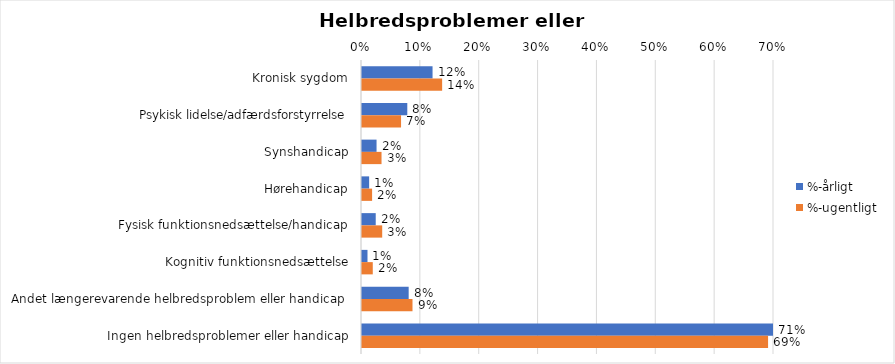
| Category | %-årligt | %-ugentligt |
|---|---|---|
| Kronisk sygdom | 0.12 | 0.136 |
| Psykisk lidelse/adfærdsforstyrrelse | 0.077 | 0.066 |
| Synshandicap | 0.025 | 0.033 |
| Hørehandicap | 0.012 | 0.017 |
| Fysisk funktionsnedsættelse/handicap | 0.023 | 0.034 |
| Kognitiv funktionsnedsættelse | 0.009 | 0.018 |
| Andet længerevarende helbredsproblem eller handicap  | 0.079 | 0.086 |
| Ingen helbredsproblemer eller handicap | 0.71 | 0.69 |